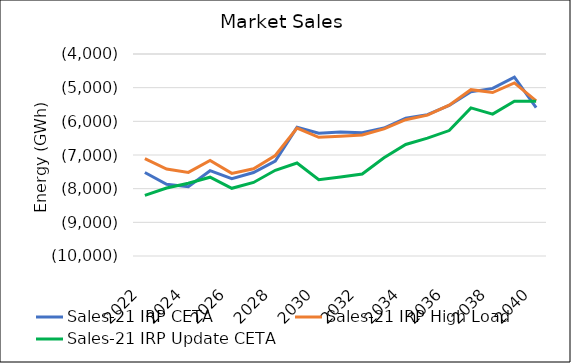
| Category | Sales-21 IRP CETA | Sales-21 IRP High Load | Sales-21 IRP Update CETA |
|---|---|---|---|
| 2022.0 | -7518.1 | -7108.53 | -8197.246 |
| 2023.0 | -7872.05 | -7417.85 | -7979.092 |
| 2024.0 | -7939.83 | -7516.11 | -7841.046 |
| 2025.0 | -7466.59 | -7161.69 | -7660.095 |
| 2026.0 | -7703.47 | -7545.65 | -7989.066 |
| 2027.0 | -7520.91 | -7410.05 | -7814.876 |
| 2028.0 | -7179.27 | -7015.63 | -7453.487 |
| 2029.0 | -6178.26 | -6199.93 | -7237.946 |
| 2030.0 | -6351.6 | -6475.51 | -7732.141 |
| 2031.0 | -6318.93 | -6440.62 | -7651.844 |
| 2032.0 | -6337.32 | -6405.69 | -7563.336 |
| 2033.0 | -6199.64 | -6223.98 | -7082.511 |
| 2034.0 | -5907.18 | -5951.32 | -6686.282 |
| 2035.0 | -5801.63 | -5815.78 | -6498.491 |
| 2036.0 | -5526.77 | -5521.17 | -6274.109 |
| 2037.0 | -5123.05 | -5059.61 | -5601.822 |
| 2038.0 | -5020.56 | -5144.77 | -5785.283 |
| 2039.0 | -4685.64 | -4860.14 | -5400.675 |
| 2040.0 | -5595.97 | -5394.57 | -5406.574 |